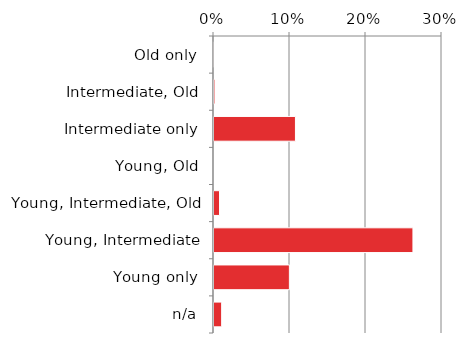
| Category | Non native |
|---|---|
| n/a | 0.011 |
| Young only | 0.1 |
| Young, Intermediate | 0.263 |
| Young, Intermediate, Old | 0.009 |
| Young, Old | 0 |
| Intermediate only | 0.108 |
| Intermediate, Old | 0.003 |
| Old only | 0 |